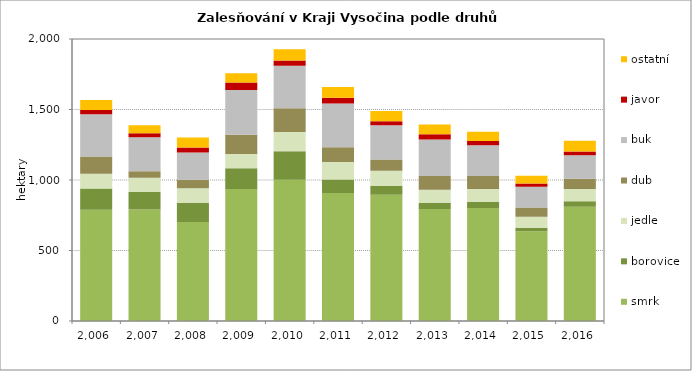
| Category | smrk | borovice | jedle | dub | buk | javor | ostatní |
|---|---|---|---|---|---|---|---|
| 2006.0 | 789 | 150 | 105 | 123 | 300 | 29 | 71 |
| 2007.0 | 791.354 | 126 | 99 | 46 | 240 | 29 | 56.646 |
| 2008.0 | 703 | 134 | 104 | 60 | 194 | 36 | 70 |
| 2009.0 | 936 | 148 | 101 | 136 | 317 | 54 | 65 |
| 2010.0 | 1001 | 203 | 136 | 168 | 302 | 38 | 80 |
| 2011.0 | 908 | 96 | 124 | 104 | 310 | 42 | 76 |
| 2012.0 | 895 | 64 | 107 | 79 | 244 | 27 | 73 |
| 2013.0 | 794 | 44 | 92 | 99 | 258 | 37 | 70 |
| 2014.0 | 801 | 45 | 90 | 93 | 218 | 30 | 66 |
| 2015.0 | 636 | 26 | 77 | 66 | 147 | 24 | 55 |
| 2016.0 | 811 | 38 | 88 | 71 | 168 | 27 | 75 |